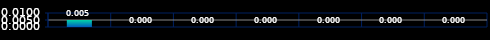
| Category | Series 0 |
|---|---|
| 0 | 0.005 |
| 1 | 0 |
| 2 | 0 |
| 3 | 0 |
| 4 | 0 |
| 5 | 0 |
| 6 | 0 |